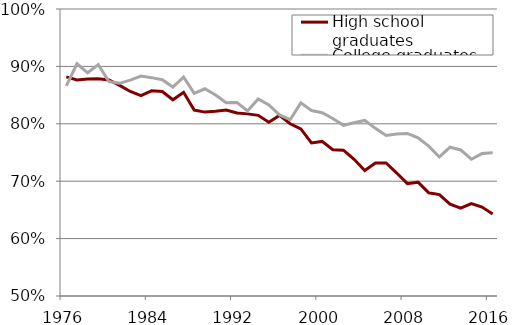
| Category | High school graduates | College graduates |
|---|---|---|
| 1976.0 | 0.882 | 0.866 |
| 1977.0 | 0.876 | 0.905 |
| 1978.0 | 0.878 | 0.889 |
| 1979.0 | 0.879 | 0.903 |
| 1980.0 | 0.876 | 0.874 |
| 1981.0 | 0.867 | 0.871 |
| 1982.0 | 0.856 | 0.876 |
| 1983.0 | 0.849 | 0.883 |
| 1984.0 | 0.857 | 0.88 |
| 1985.0 | 0.856 | 0.877 |
| 1986.0 | 0.842 | 0.864 |
| 1987.0 | 0.855 | 0.881 |
| 1988.0 | 0.824 | 0.853 |
| 1989.0 | 0.82 | 0.861 |
| 1990.0 | 0.822 | 0.85 |
| 1991.0 | 0.824 | 0.837 |
| 1992.0 | 0.819 | 0.837 |
| 1993.0 | 0.817 | 0.822 |
| 1994.0 | 0.815 | 0.843 |
| 1995.0 | 0.803 | 0.833 |
| 1996.0 | 0.815 | 0.816 |
| 1997.0 | 0.8 | 0.807 |
| 1998.0 | 0.791 | 0.836 |
| 1999.0 | 0.767 | 0.823 |
| 2000.0 | 0.769 | 0.819 |
| 2001.0 | 0.755 | 0.809 |
| 2002.0 | 0.754 | 0.797 |
| 2003.0 | 0.738 | 0.802 |
| 2004.0 | 0.719 | 0.806 |
| 2005.0 | 0.732 | 0.792 |
| 2006.0 | 0.732 | 0.78 |
| 2007.0 | 0.714 | 0.782 |
| 2008.0 | 0.696 | 0.783 |
| 2009.0 | 0.698 | 0.776 |
| 2010.0 | 0.68 | 0.761 |
| 2011.0 | 0.677 | 0.742 |
| 2012.0 | 0.66 | 0.759 |
| 2013.0 | 0.653 | 0.754 |
| 2014.0 | 0.661 | 0.738 |
| 2015.0 | 0.655 | 0.748 |
| 2016.0 | 0.643 | 0.749 |